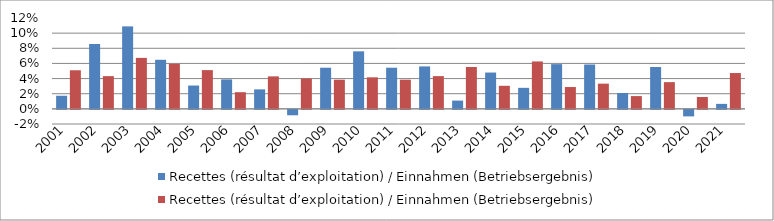
| Category | Recettes (résultat d’exploitation) / Einnahmen (Betriebsergebnis) |
|---|---|
| 2001.0 | 0.051 |
| 2002.0 | 0.043 |
| 2003.0 | 0.067 |
| 2004.0 | 0.059 |
| 2005.0 | 0.051 |
| 2006.0 | 0.022 |
| 2007.0 | 0.043 |
| 2008.0 | 0.04 |
| 2009.0 | 0.039 |
| 2010.0 | 0.042 |
| 2011.0 | 0.039 |
| 2012.0 | 0.043 |
| 2013.0 | 0.055 |
| 2014.0 | 0.03 |
| 2015.0 | 0.063 |
| 2016.0 | 0.029 |
| 2017.0 | 0.033 |
| 2018.0 | 0.017 |
| 2019.0 | 0.035 |
| 2020.0 | 0.016 |
| 2021.0 | 0.047 |